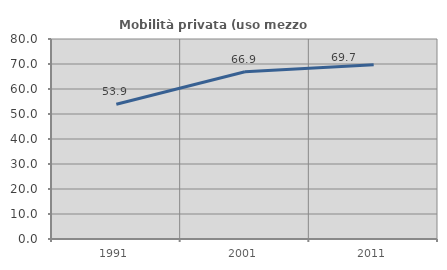
| Category | Mobilità privata (uso mezzo privato) |
|---|---|
| 1991.0 | 53.905 |
| 2001.0 | 66.898 |
| 2011.0 | 69.739 |